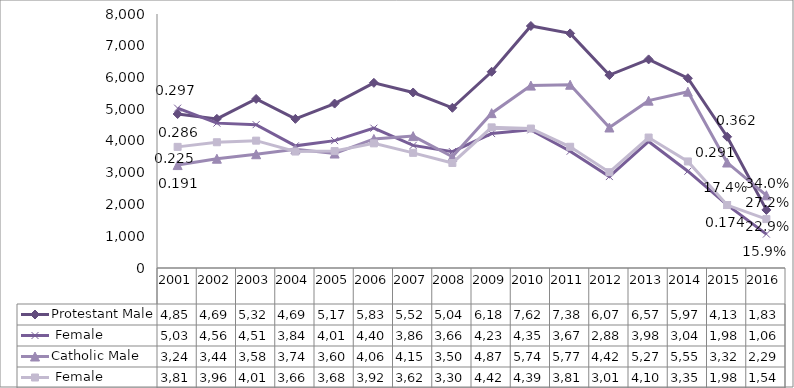
| Category | Protestant | Catholic |
|---|---|---|
| 2001.0 | 5034 | 3815 |
| 2002.0 | 4563 | 3961 |
| 2003.0 | 4515 | 4011 |
| 2004.0 | 3847 | 3668 |
| 2005.0 | 4012 | 3682 |
| 2006.0 | 4404 | 3926 |
| 2007.0 | 3861 | 3627 |
| 2008.0 | 3665 | 3308 |
| 2009.0 | 4234 | 4429 |
| 2010.0 | 4352 | 4392 |
| 2011.0 | 3678 | 3818 |
| 2012.0 | 2880 | 3018 |
| 2013.0 | 3986 | 4109 |
| 2014.0 | 3049 | 3356 |
| 2015.0 | 1987 | 1983 |
| 2016.0 | 1068 | 1540 |